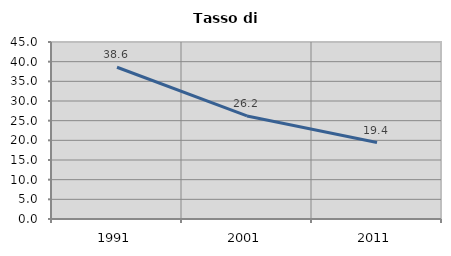
| Category | Tasso di disoccupazione   |
|---|---|
| 1991.0 | 38.584 |
| 2001.0 | 26.209 |
| 2011.0 | 19.438 |